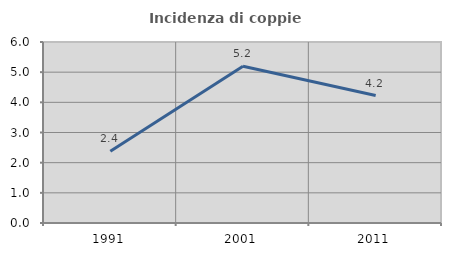
| Category | Incidenza di coppie miste |
|---|---|
| 1991.0 | 2.381 |
| 2001.0 | 5.195 |
| 2011.0 | 4.225 |